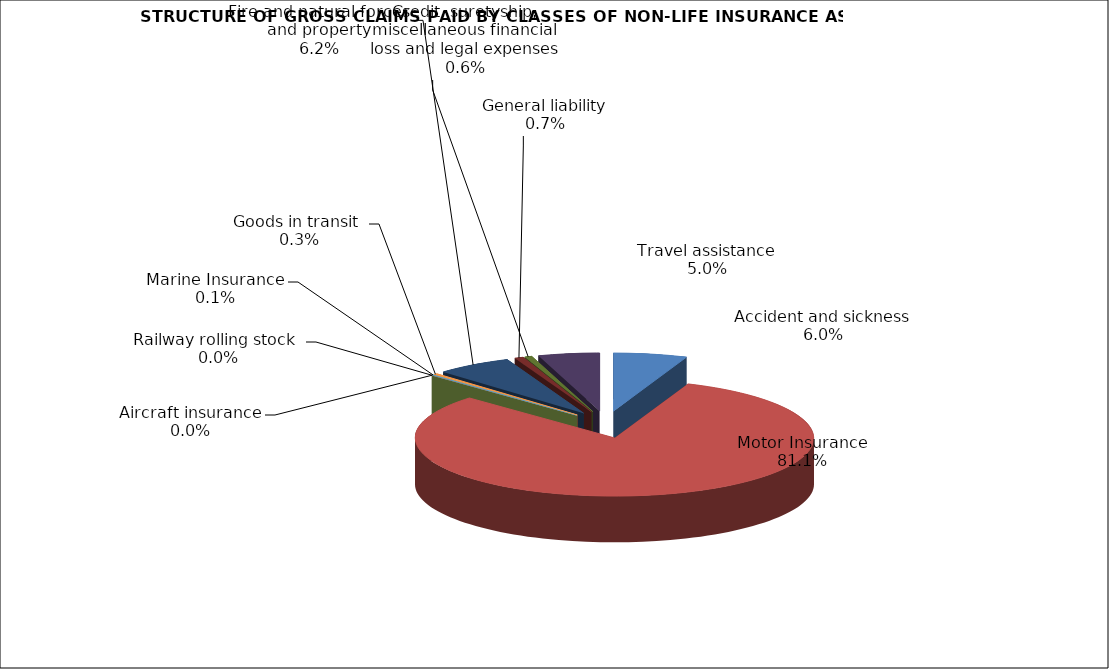
| Category | Accident and sickness |
|---|---|
| Accident and sickness | 0.06 |
| Motor Insurance | 0.811 |
| Railway rolling stock  | 0 |
| Aircraft insurance | 0 |
| Marine Insurance | 0.001 |
| Goods in transit  | 0.003 |
| Fire and natural forces and property | 0.062 |
| General liability | 0.007 |
| Credit, suretyship, miscellaneous financial loss and legal expenses | 0.006 |
| Travel assistance | 0.05 |